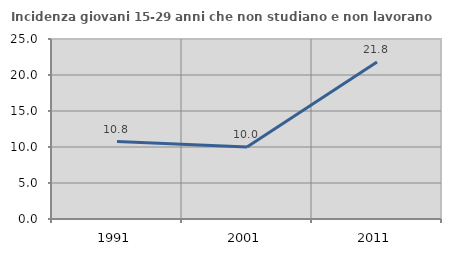
| Category | Incidenza giovani 15-29 anni che non studiano e non lavorano  |
|---|---|
| 1991.0 | 10.754 |
| 2001.0 | 10 |
| 2011.0 | 21.805 |